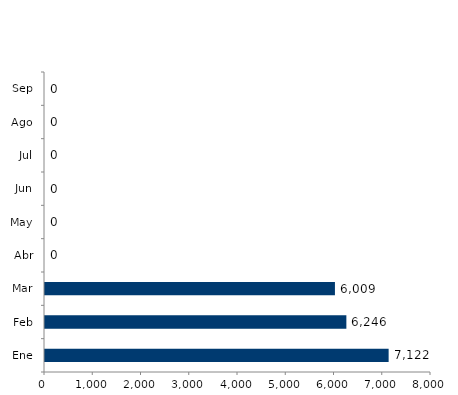
| Category | Series 0 |
|---|---|
| Ene | 7122 |
| Feb | 6246 |
| Mar | 6009 |
| Abr | 0 |
| May | 0 |
| Jun | 0 |
| Jul | 0 |
| Ago | 0 |
| Sep | 0 |